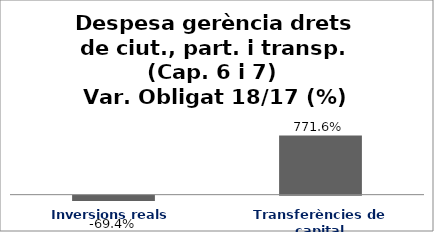
| Category | Series 0 |
|---|---|
| Inversions reals | -0.694 |
| Transferències de capital | 7.716 |